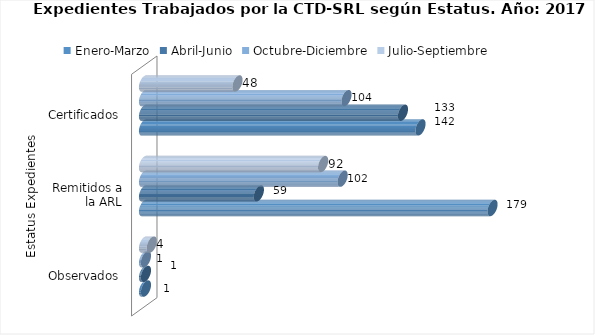
| Category | Enero-Marzo | Abril-Junio | Octubre-Diciembre | Julio-Septiembre |
|---|---|---|---|---|
| 0 | 1 | 1 | 1 | 4 |
| 1 | 179 | 59 | 102 | 92 |
| 2 | 142 | 133 | 104 | 48 |